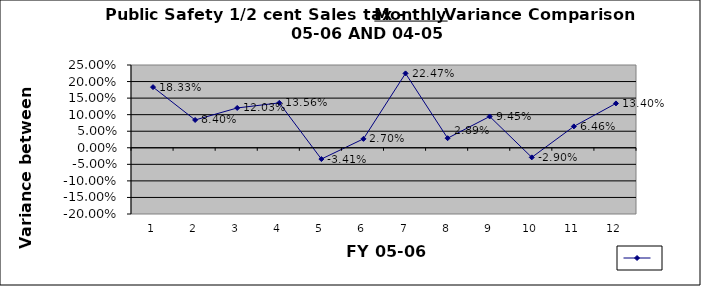
| Category | Series 0 |
|---|---|
| 0 | 0.183 |
| 1 | 0.084 |
| 2 | 0.12 |
| 3 | 0.136 |
| 4 | -0.034 |
| 5 | 0.027 |
| 6 | 0.225 |
| 7 | 0.029 |
| 8 | 0.095 |
| 9 | -0.029 |
| 10 | 0.065 |
| 11 | 0.134 |